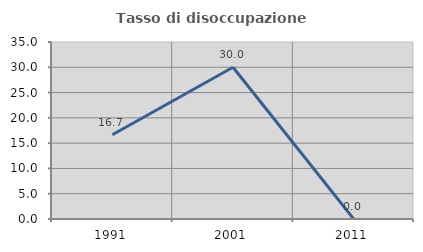
| Category | Tasso di disoccupazione giovanile  |
|---|---|
| 1991.0 | 16.667 |
| 2001.0 | 30 |
| 2011.0 | 0 |